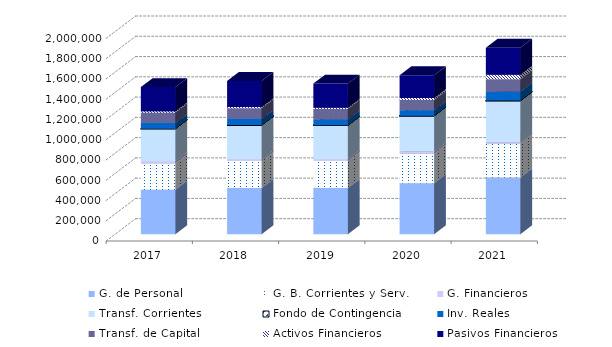
| Category | G. de Personal | G. B. Corrientes y Serv. | G. Financieros | Transf. Corrientes | Fondo de Contingencia | Inv. Reales | Transf. de Capital | Activos Financieros | Pasivos Financieros |
|---|---|---|---|---|---|---|---|---|---|
| 2017.0 | 440058.89 | 259317.69 | 24101.25 | 318902.58 | 1 | 55701.46 | 102564.13 | 12791.54 | 239136.46 |
| 2018.0 | 456311.97 | 266147.25 | 21592.96 | 333759.71 | 1.17 | 60120.86 | 106241.71 | 11093.05 | 258624.32 |
| 2019.0 | 456311.97 | 266147.25 | 20613.51 | 332276.21 | 1.17 | 57518.51 | 104211.31 | 11093.05 | 238888.3 |
| 2020.0 | 504997.74 | 290355.06 | 22035.15 | 352276.39 | 156.8 | 54913.62 | 100007.88 | 21045.19 | 224040.29 |
| 2021.0 | 559390.09 | 334186.28 | 14213.43 | 410163.53 | 1257.92 | 87547.38 | 122691.37 | 45153.52 | 265755.56 |